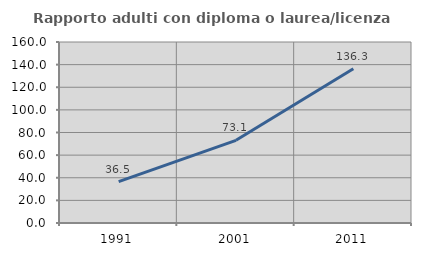
| Category | Rapporto adulti con diploma o laurea/licenza media  |
|---|---|
| 1991.0 | 36.543 |
| 2001.0 | 73.072 |
| 2011.0 | 136.296 |